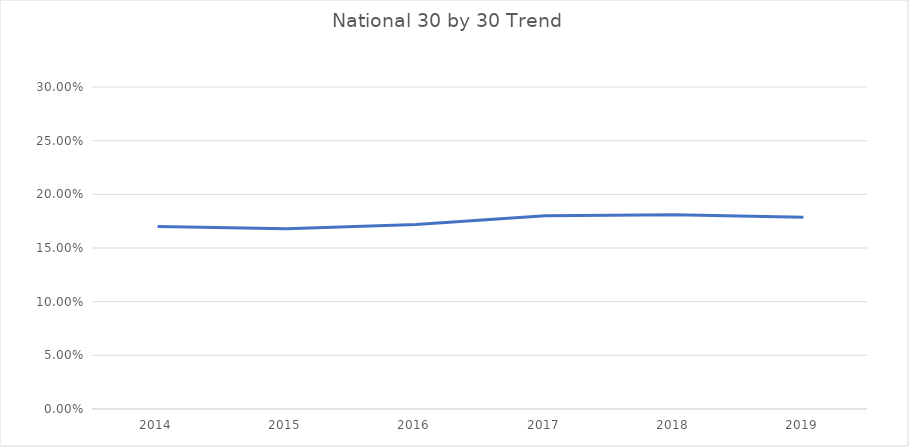
| Category |   National 30 by 30 Percentage   |
|---|---|
| 2014.0 | 0.17 |
| 2015.0 | 0.168 |
| 2016.0 | 0.172 |
| 2017.0 | 0.18 |
| 2018.0 | 0.181 |
| 2019.0 | 0.179 |